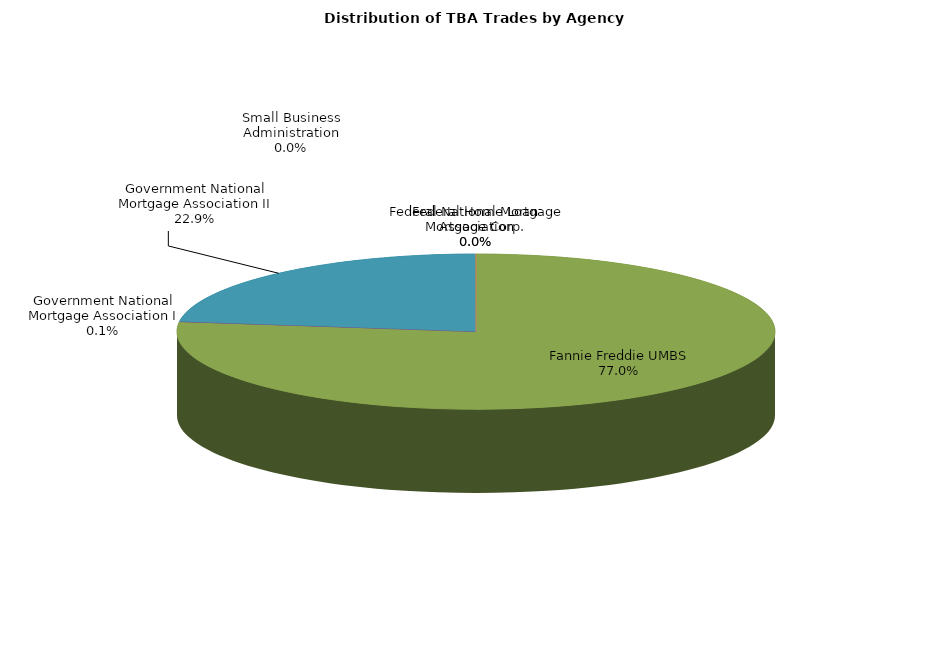
| Category | Series 0 |
|---|---|
| Federal Home Loan Mortgage Corp. | 0.175 |
| Federal National Mortgage Association | 0 |
| Fannie Freddie UMBS | 5753.004 |
| Government National Mortgage Association I | 9.199 |
| Government National Mortgage Association II | 1712.813 |
| Small Business Administration | 0.972 |